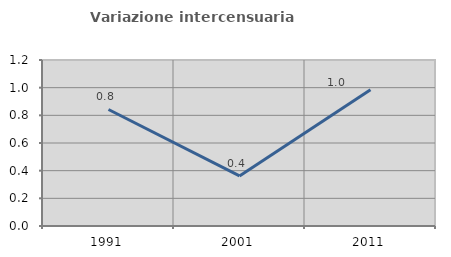
| Category | Variazione intercensuaria annua |
|---|---|
| 1991.0 | 0.842 |
| 2001.0 | 0.362 |
| 2011.0 | 0.986 |